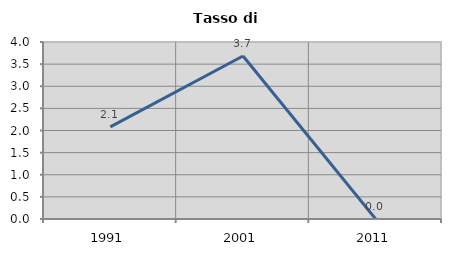
| Category | Tasso di disoccupazione   |
|---|---|
| 1991.0 | 2.083 |
| 2001.0 | 3.684 |
| 2011.0 | 0 |